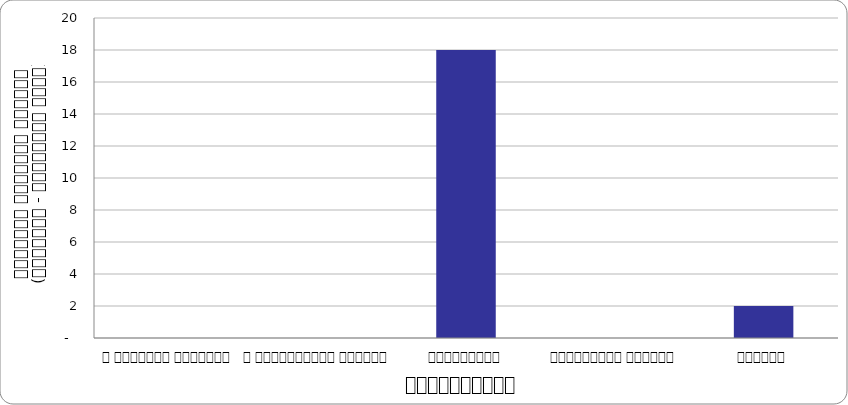
| Category | भ्रष्टाचार |
|---|---|
| द हिमालयन टाइम्स् | 0 |
| द काठमाण्डौं पोस्ट् | 0 |
| कान्तिपुर | 18 |
| अन्नपूर्ण पोस्ट् | 0 |
| नागरिक | 2 |